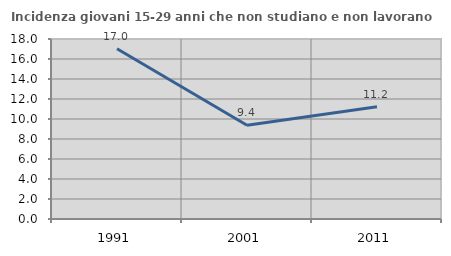
| Category | Incidenza giovani 15-29 anni che non studiano e non lavorano  |
|---|---|
| 1991.0 | 17.033 |
| 2001.0 | 9.382 |
| 2011.0 | 11.224 |